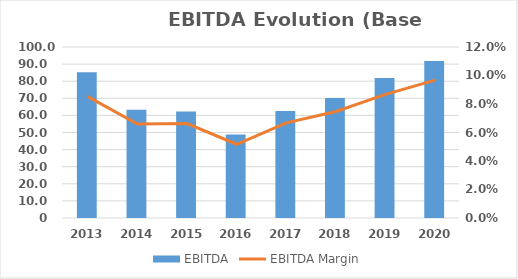
| Category | EBITDA |
|---|---|
| 2013.0 | 85.247 |
| 2014.0 | 63.376 |
| 2015.0 | 62.274 |
| 2016.0 | 48.802 |
| 2017.0 | 62.621 |
| 2018.0 | 70.192 |
| 2019.0 | 81.861 |
| 2020.0 | 91.749 |